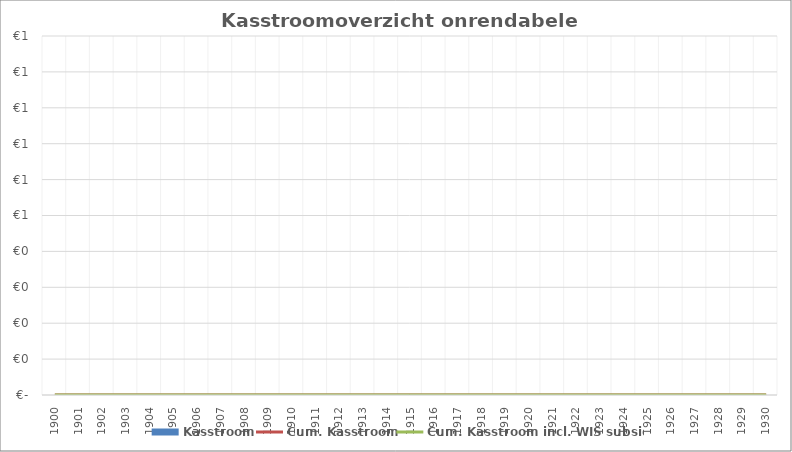
| Category | Kasstroom |
|---|---|
| 1900.0 | 0 |
| 1901.0 | 0 |
| 1902.0 | 0 |
| 1903.0 | 0 |
| 1904.0 | 0 |
| 1905.0 | 0 |
| 1906.0 | 0 |
| 1907.0 | 0 |
| 1908.0 | 0 |
| 1909.0 | 0 |
| 1910.0 | 0 |
| 1911.0 | 0 |
| 1912.0 | 0 |
| 1913.0 | 0 |
| 1914.0 | 0 |
| 1915.0 | 0 |
| 1916.0 | 0 |
| 1917.0 | 0 |
| 1918.0 | 0 |
| 1919.0 | 0 |
| 1920.0 | 0 |
| 1921.0 | 0 |
| 1922.0 | 0 |
| 1923.0 | 0 |
| 1924.0 | 0 |
| 1925.0 | 0 |
| 1926.0 | 0 |
| 1927.0 | 0 |
| 1928.0 | 0 |
| 1929.0 | 0 |
| 1930.0 | 0 |